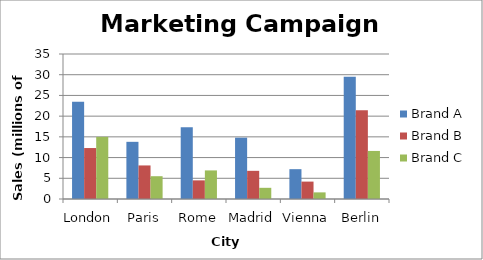
| Category | Brand A | Brand B | Brand C |
|---|---|---|---|
| London | 23.5 | 12.3 | 15 |
| Paris | 13.8 | 8.1 | 5.5 |
| Rome | 17.3 | 4.5 | 6.9 |
| Madrid | 14.8 | 6.8 | 2.7 |
| Vienna | 7.2 | 4.2 | 1.6 |
| Berlin | 29.5 | 21.4 | 11.6 |